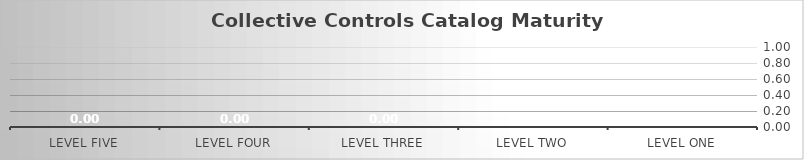
| Category | Score: |
|---|---|
| Level One | 0 |
| Level Two | 0 |
| Level Three | 0 |
| Level Four | 0 |
| Level Five | 0 |